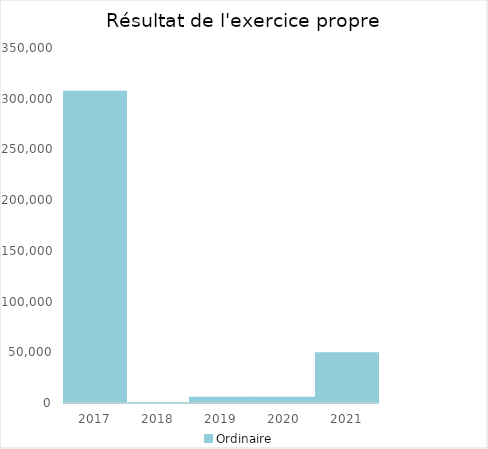
| Category |   | Ordinaire |    |
|---|---|---|---|
| 2017.0 |  | 306790.51 |  |
| 2018.0 |  | 68.87 |  |
| 2019.0 |  | 5098.3 |  |
| 2020.0 |  | 5283.37 |  |
| 2021.0 |  | 49092.99 |  |